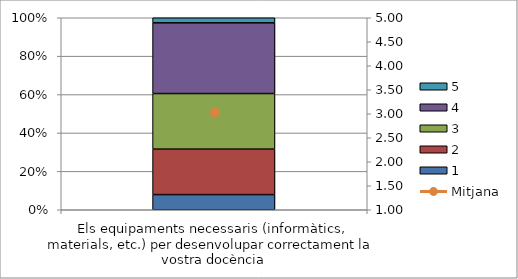
| Category | 1 | 2 | 3 | 4 | 5 |
|---|---|---|---|---|---|
| Els equipaments necessaris (informàtics, materials, etc.) per desenvolupar correctament la vostra docència | 3 | 9 | 11 | 14 | 1 |